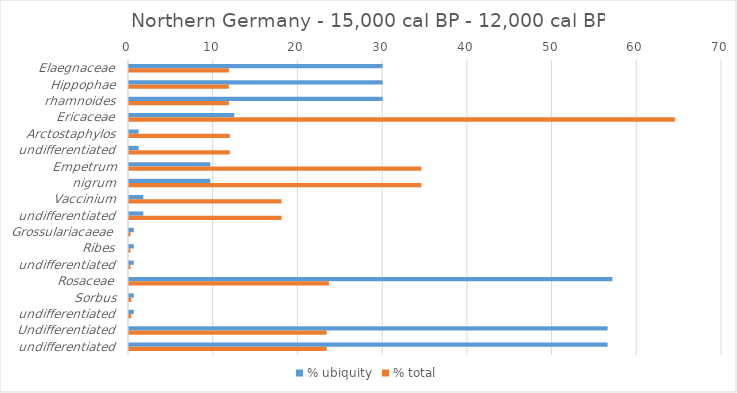
| Category | % ubiquity | % total |
|---|---|---|
| Elaegnaceae | 29.944 | 11.793 |
| Hippophae | 29.944 | 11.793 |
| rhamnoides | 29.944 | 11.793 |
| Ericaceae | 12.429 | 64.429 |
| Arctostaphylos | 1.13 | 11.9 |
| undifferentiated | 1.13 | 11.9 |
| Empetrum | 9.605 | 34.522 |
| nigrum | 9.605 | 34.522 |
| Vaccinium | 1.695 | 18.006 |
| undifferentiated | 1.695 | 18.006 |
| Grossulariacaeae | 0.565 | 0.178 |
| Ribes | 0.565 | 0.178 |
| undifferentiated | 0.565 | 0.178 |
| Rosaceae | 57.062 | 23.601 |
| Sorbus | 0.565 | 0.27 |
| undifferentiated | 0.565 | 0.27 |
| Undifferentiated | 56.497 | 23.331 |
| undifferentiated | 56.497 | 23.331 |